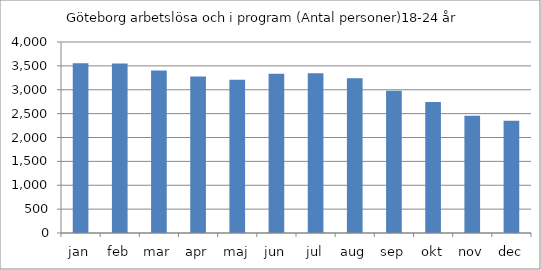
| Category | Göteborg |
|---|---|
| jan | 3553 |
| feb | 3549 |
| mar | 3404 |
| apr | 3276 |
| maj | 3210 |
| jun | 3337 |
| jul | 3345 |
| aug | 3242 |
| sep | 2981 |
| okt | 2746 |
| nov | 2454 |
| dec | 2349 |